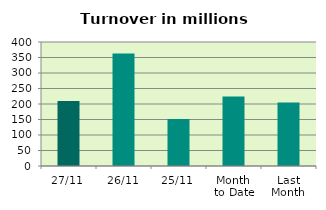
| Category | Series 0 |
|---|---|
| 27/11 | 209.832 |
| 26/11 | 363.18 |
| 25/11 | 151.398 |
| Month 
to Date | 223.949 |
| Last
Month | 204.729 |